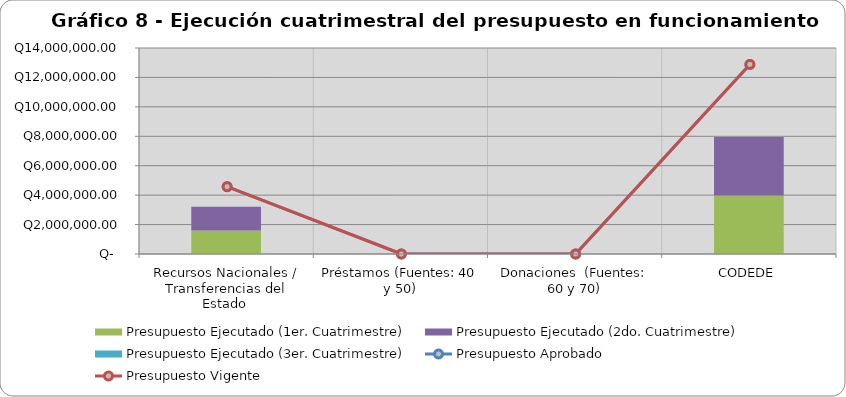
| Category | Presupuesto Ejecutado (1er. Cuatrimestre) | Presupuesto Ejecutado (2do. Cuatrimestre) | Presupuesto Ejecutado (3er. Cuatrimestre) |
|---|---|---|---|
| Recursos Nacionales / Transferencias del Estado  | 1605004.72 | 1607234.55 | 0 |
| Préstamos (Fuentes: 40 y 50) | 0 | 0 | 0 |
| Donaciones  (Fuentes: 60 y 70) | 0 | 0 | 0 |
| CODEDE | 3977901.66 | 3970923.4 | 0 |